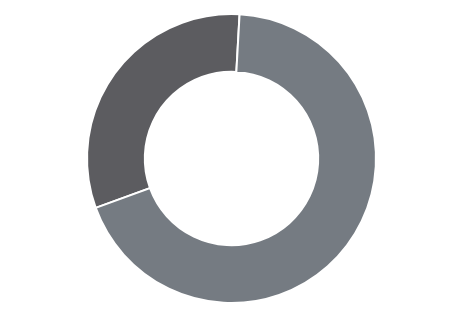
| Category | Series 0 |
|---|---|
| 0 | 327333 |
| 1 | 713607 |